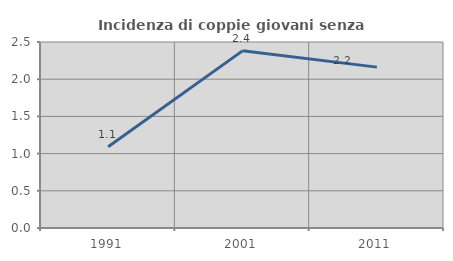
| Category | Incidenza di coppie giovani senza figli |
|---|---|
| 1991.0 | 1.091 |
| 2001.0 | 2.381 |
| 2011.0 | 2.162 |